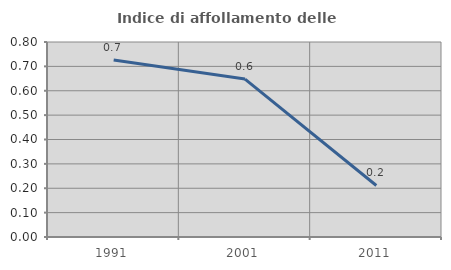
| Category | Indice di affollamento delle abitazioni  |
|---|---|
| 1991.0 | 0.726 |
| 2001.0 | 0.648 |
| 2011.0 | 0.211 |